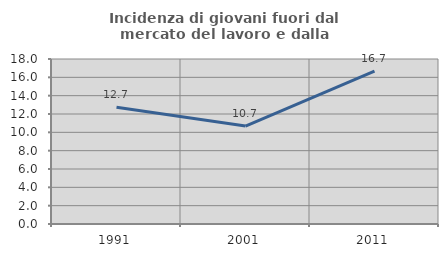
| Category | Incidenza di giovani fuori dal mercato del lavoro e dalla formazione  |
|---|---|
| 1991.0 | 12.727 |
| 2001.0 | 10.68 |
| 2011.0 | 16.667 |